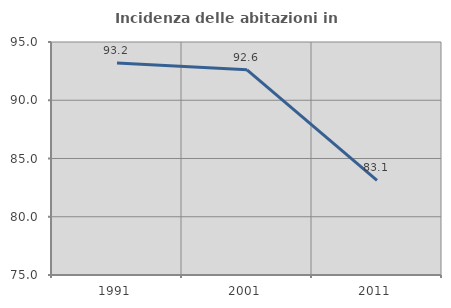
| Category | Incidenza delle abitazioni in proprietà  |
|---|---|
| 1991.0 | 93.195 |
| 2001.0 | 92.614 |
| 2011.0 | 83.129 |